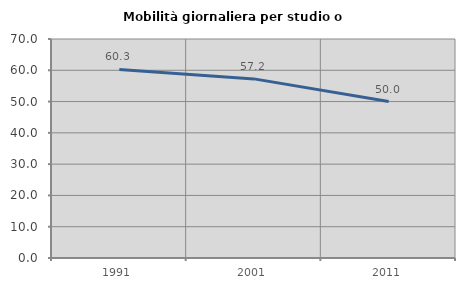
| Category | Mobilità giornaliera per studio o lavoro |
|---|---|
| 1991.0 | 60.284 |
| 2001.0 | 57.249 |
| 2011.0 | 50 |